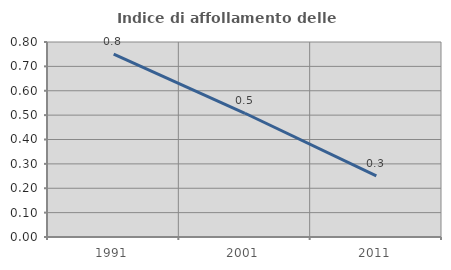
| Category | Indice di affollamento delle abitazioni  |
|---|---|
| 1991.0 | 0.75 |
| 2001.0 | 0.508 |
| 2011.0 | 0.251 |